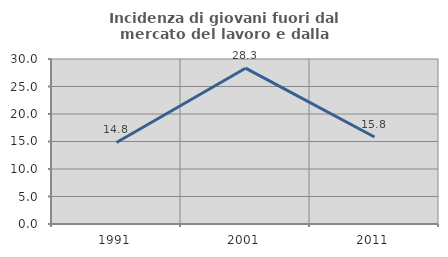
| Category | Incidenza di giovani fuori dal mercato del lavoro e dalla formazione  |
|---|---|
| 1991.0 | 14.823 |
| 2001.0 | 28.331 |
| 2011.0 | 15.816 |